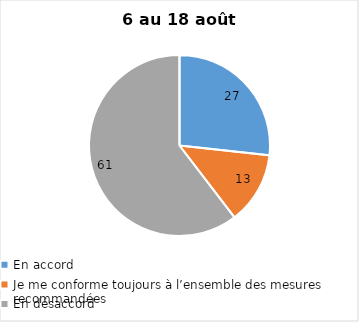
| Category | Series 0 |
|---|---|
| En accord | 27 |
| Je me conforme toujours à l’ensemble des mesures recommandées | 13 |
| En désaccord | 61 |